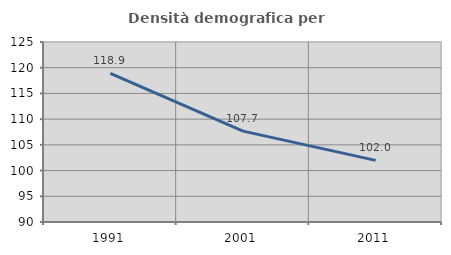
| Category | Densità demografica |
|---|---|
| 1991.0 | 118.908 |
| 2001.0 | 107.67 |
| 2011.0 | 101.976 |